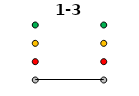
| Category | 0 | 1 | 2 | 3 |
|---|---|---|---|---|
| Time 1 | 0 | 1 | 2 | 3 |
| Time 2 | 0 | 1 | 2 | 3 |